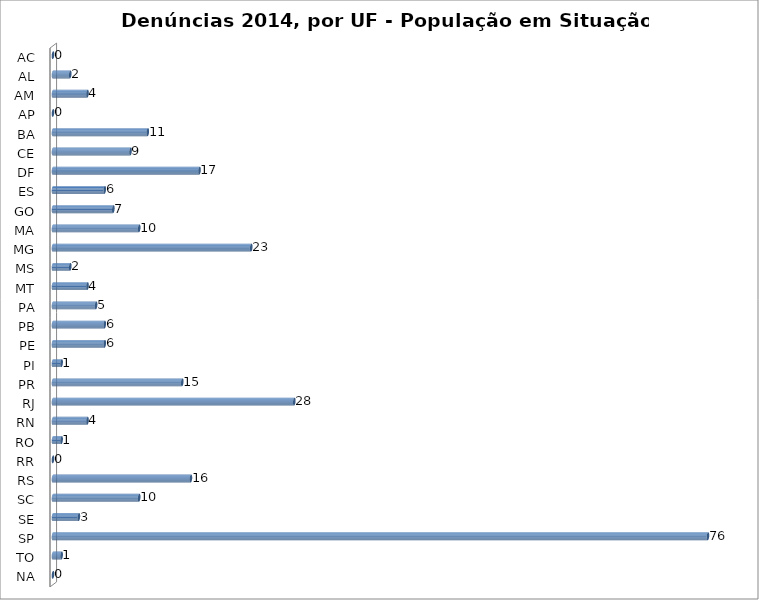
| Category | Series 0 |
|---|---|
| AC | 0 |
| AL | 2 |
| AM | 4 |
| AP | 0 |
| BA | 11 |
| CE | 9 |
| DF | 17 |
| ES | 6 |
| GO | 7 |
| MA | 10 |
| MG | 23 |
| MS | 2 |
| MT | 4 |
| PA | 5 |
| PB | 6 |
| PE | 6 |
| PI | 1 |
| PR | 15 |
| RJ | 28 |
| RN | 4 |
| RO | 1 |
| RR | 0 |
| RS | 16 |
| SC | 10 |
| SE | 3 |
| SP | 76 |
| TO | 1 |
| NA | 0 |